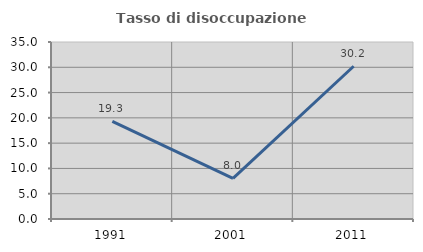
| Category | Tasso di disoccupazione giovanile  |
|---|---|
| 1991.0 | 19.291 |
| 2001.0 | 8.025 |
| 2011.0 | 30.208 |